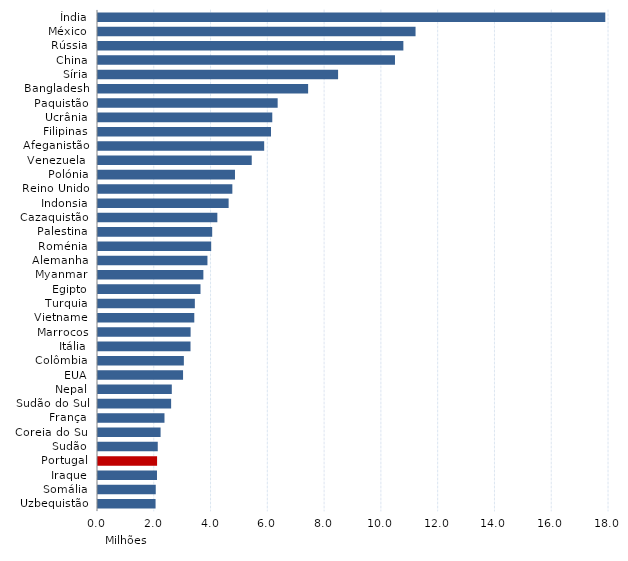
| Category | Series 0 |
|---|---|
|   Índia | 17.869 |
|  México | 11.186 |
|   Rússia | 10.757 |
|   China | 10.461 |
|   Síria | 8.457 |
|   Bangladesh | 7.402 |
|   Paquistão | 6.328 |
|   Ucrânia | 6.139 |
|   Filipinas | 6.094 |
|   Afeganistão | 5.854 |
|   Venezuela  | 5.415 |
|   Polónia | 4.825 |
|   Reino Unido | 4.733 |
|   Indonsia | 4.601 |
|  Cazaquistão | 4.204 |
|  Palestina | 4.023 |
|  Roménia | 3.987 |
|  Alemanha | 3.855 |
|  Myanmar | 3.712 |
|  Egipto | 3.61 |
|  Turquia | 3.411 |
|  Vietname | 3.392 |
|  Marrocos | 3.262 |
|  Itália | 3.259 |
|  Colômbia | 3.024 |
|  EUA | 2.996 |
|  Nepal | 2.6 |
|  Sudão do Sul | 2.576 |
|  França | 2.342 |
|  Coreia do Sul | 2.205 |
|  Sudão | 2.105 |
|  Portugal | 2.081 |
|  Iraque | 2.078 |
|  Somália | 2.034 |
|  Uzbequistão | 2.028 |